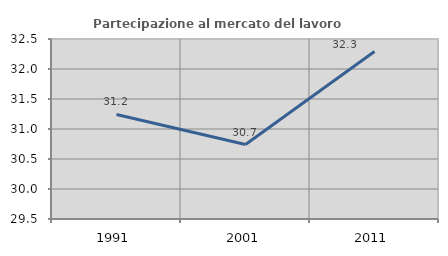
| Category | Partecipazione al mercato del lavoro  femminile |
|---|---|
| 1991.0 | 31.243 |
| 2001.0 | 30.74 |
| 2011.0 | 32.293 |